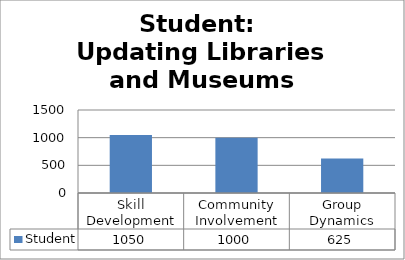
| Category | Student |
|---|---|
| Skill Development | 1050 |
| Community Involvement | 1000 |
| Group Dynamics | 625 |